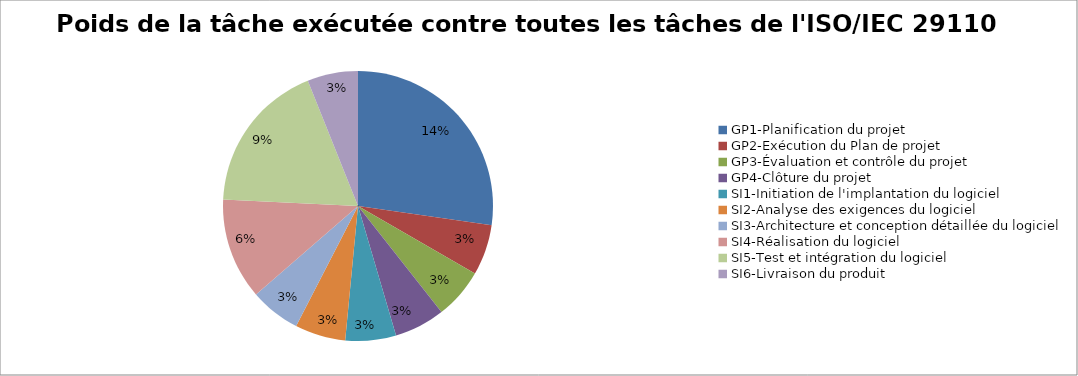
| Category | % Point vers les 33 tâches |
|---|---|
| GP1-Planification du projet | 0.136 |
| GP2-Exécution du Plan de projet | 0.03 |
| GP3-Évaluation et contrôle du projet | 0.03 |
| GP4-Clôture du projet | 0.03 |
| SI1-Initiation de l'implantation du logiciel | 0.03 |
| SI2-Analyse des exigences du logiciel | 0.03 |
| SI3-Architecture et conception détaillée du logiciel | 0.03 |
| SI4-Réalisation du logiciel | 0.061 |
| SI5-Test et intégration du logiciel | 0.091 |
| SI6-Livraison du produit | 0.03 |